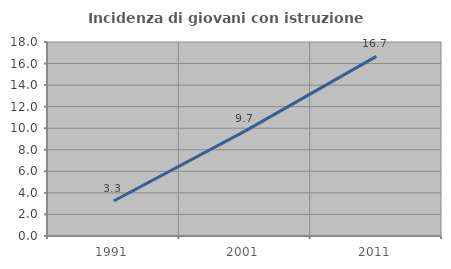
| Category | Incidenza di giovani con istruzione universitaria |
|---|---|
| 1991.0 | 3.252 |
| 2001.0 | 9.735 |
| 2011.0 | 16.667 |